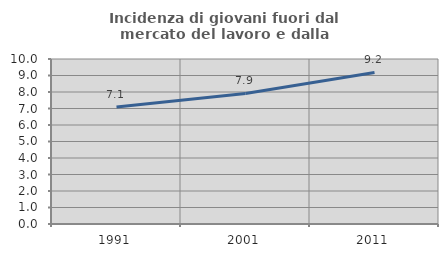
| Category | Incidenza di giovani fuori dal mercato del lavoro e dalla formazione  |
|---|---|
| 1991.0 | 7.095 |
| 2001.0 | 7.914 |
| 2011.0 | 9.184 |